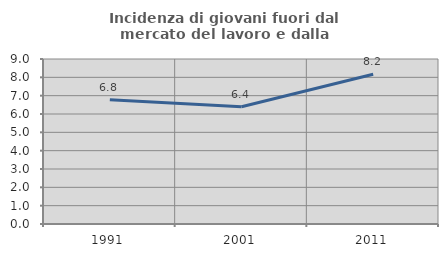
| Category | Incidenza di giovani fuori dal mercato del lavoro e dalla formazione  |
|---|---|
| 1991.0 | 6.775 |
| 2001.0 | 6.391 |
| 2011.0 | 8.172 |